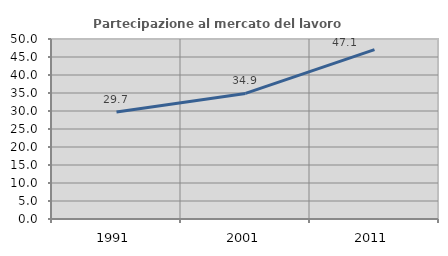
| Category | Partecipazione al mercato del lavoro  femminile |
|---|---|
| 1991.0 | 29.73 |
| 2001.0 | 34.884 |
| 2011.0 | 47.059 |